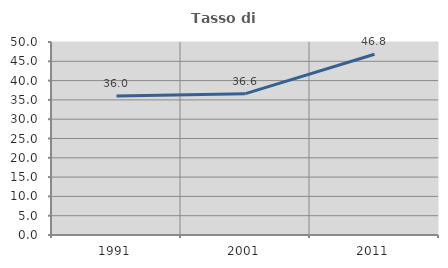
| Category | Tasso di occupazione   |
|---|---|
| 1991.0 | 36 |
| 2001.0 | 36.615 |
| 2011.0 | 46.835 |